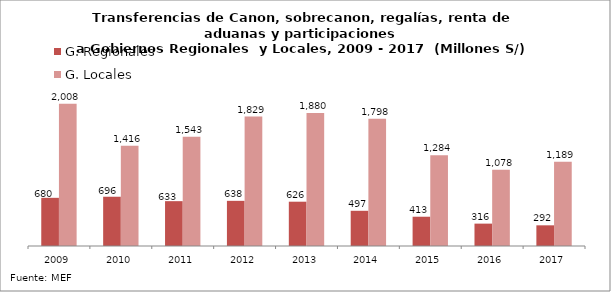
| Category | G. Regionales | G. Locales |
|---|---|---|
| 2009.0 | 680.41 | 2008.165 |
| 2010.0 | 695.801 | 1415.998 |
| 2011.0 | 633.363 | 1543.009 |
| 2012.0 | 637.819 | 1828.665 |
| 2013.0 | 625.659 | 1880.237 |
| 2014.0 | 497.284 | 1797.849 |
| 2015.0 | 413.46 | 1283.53 |
| 2016.0 | 315.971 | 1078.326 |
| 2017.0 | 292.066 | 1189.008 |